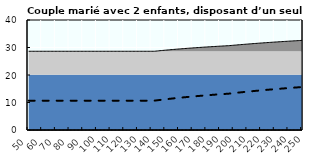
| Category | Coin fiscal moyen (somme des composantes) | Taux moyen d'imposition net en % du salaire brut |
|---|---|---|
| 50.0 | 28.633 | 10.67 |
| 51.0 | 28.633 | 10.67 |
| 52.0 | 28.633 | 10.67 |
| 53.0 | 28.633 | 10.67 |
| 54.0 | 28.633 | 10.67 |
| 55.0 | 28.633 | 10.67 |
| 56.0 | 28.633 | 10.67 |
| 57.0 | 28.633 | 10.67 |
| 58.0 | 28.633 | 10.67 |
| 59.0 | 28.633 | 10.67 |
| 60.0 | 28.633 | 10.67 |
| 61.0 | 28.633 | 10.67 |
| 62.0 | 28.633 | 10.67 |
| 63.0 | 28.633 | 10.67 |
| 64.0 | 28.633 | 10.67 |
| 65.0 | 28.633 | 10.67 |
| 66.0 | 28.633 | 10.67 |
| 67.0 | 28.633 | 10.67 |
| 68.0 | 28.633 | 10.67 |
| 69.0 | 28.633 | 10.67 |
| 70.0 | 28.633 | 10.67 |
| 71.0 | 28.633 | 10.67 |
| 72.0 | 28.633 | 10.67 |
| 73.0 | 28.633 | 10.67 |
| 74.0 | 28.633 | 10.67 |
| 75.0 | 28.633 | 10.67 |
| 76.0 | 28.633 | 10.67 |
| 77.0 | 28.633 | 10.67 |
| 78.0 | 28.633 | 10.67 |
| 79.0 | 28.633 | 10.67 |
| 80.0 | 28.633 | 10.67 |
| 81.0 | 28.633 | 10.67 |
| 82.0 | 28.633 | 10.67 |
| 83.0 | 28.633 | 10.67 |
| 84.0 | 28.633 | 10.67 |
| 85.0 | 28.633 | 10.67 |
| 86.0 | 28.633 | 10.67 |
| 87.0 | 28.633 | 10.67 |
| 88.0 | 28.633 | 10.67 |
| 89.0 | 28.633 | 10.67 |
| 90.0 | 28.633 | 10.67 |
| 91.0 | 28.633 | 10.67 |
| 92.0 | 28.633 | 10.67 |
| 93.0 | 28.633 | 10.67 |
| 94.0 | 28.633 | 10.67 |
| 95.0 | 28.633 | 10.67 |
| 96.0 | 28.633 | 10.67 |
| 97.0 | 28.633 | 10.67 |
| 98.0 | 28.633 | 10.67 |
| 99.0 | 28.633 | 10.67 |
| 100.0 | 28.633 | 10.67 |
| 101.0 | 28.633 | 10.67 |
| 102.0 | 28.633 | 10.67 |
| 103.0 | 28.633 | 10.67 |
| 104.0 | 28.633 | 10.67 |
| 105.0 | 28.633 | 10.67 |
| 106.0 | 28.633 | 10.67 |
| 107.0 | 28.633 | 10.67 |
| 108.0 | 28.633 | 10.67 |
| 109.0 | 28.633 | 10.67 |
| 110.0 | 28.633 | 10.67 |
| 111.0 | 28.633 | 10.67 |
| 112.0 | 28.633 | 10.67 |
| 113.0 | 28.633 | 10.67 |
| 114.0 | 28.633 | 10.67 |
| 115.0 | 28.633 | 10.67 |
| 116.0 | 28.633 | 10.67 |
| 117.0 | 28.633 | 10.67 |
| 118.0 | 28.633 | 10.67 |
| 119.0 | 28.633 | 10.67 |
| 120.0 | 28.633 | 10.67 |
| 121.0 | 28.633 | 10.67 |
| 122.0 | 28.633 | 10.67 |
| 123.0 | 28.633 | 10.67 |
| 124.0 | 28.633 | 10.67 |
| 125.0 | 28.633 | 10.67 |
| 126.0 | 28.633 | 10.67 |
| 127.0 | 28.633 | 10.67 |
| 128.0 | 28.633 | 10.67 |
| 129.0 | 28.633 | 10.67 |
| 130.0 | 28.633 | 10.67 |
| 131.0 | 28.633 | 10.67 |
| 132.0 | 28.633 | 10.67 |
| 133.0 | 28.633 | 10.67 |
| 134.0 | 28.633 | 10.67 |
| 135.0 | 28.633 | 10.67 |
| 136.0 | 28.633 | 10.67 |
| 137.0 | 28.633 | 10.67 |
| 138.0 | 28.633 | 10.67 |
| 139.0 | 28.633 | 10.67 |
| 140.0 | 28.633 | 10.67 |
| 141.0 | 28.633 | 10.67 |
| 142.0 | 28.64 | 10.679 |
| 143.0 | 28.692 | 10.743 |
| 144.0 | 28.742 | 10.806 |
| 145.0 | 28.792 | 10.869 |
| 146.0 | 28.841 | 10.93 |
| 147.0 | 28.889 | 10.991 |
| 148.0 | 28.937 | 11.051 |
| 149.0 | 28.984 | 11.11 |
| 150.0 | 29.031 | 11.168 |
| 151.0 | 29.077 | 11.226 |
| 152.0 | 29.122 | 11.282 |
| 153.0 | 29.167 | 11.338 |
| 154.0 | 29.211 | 11.394 |
| 155.0 | 29.255 | 11.448 |
| 156.0 | 29.298 | 11.502 |
| 157.0 | 29.34 | 11.555 |
| 158.0 | 29.382 | 11.608 |
| 159.0 | 29.424 | 11.659 |
| 160.0 | 29.464 | 11.711 |
| 161.0 | 29.505 | 11.761 |
| 162.0 | 29.545 | 11.811 |
| 163.0 | 29.584 | 11.86 |
| 164.0 | 29.623 | 11.909 |
| 165.0 | 29.661 | 11.957 |
| 166.0 | 29.699 | 12.005 |
| 167.0 | 29.737 | 12.052 |
| 168.0 | 29.774 | 12.098 |
| 169.0 | 29.811 | 12.144 |
| 170.0 | 29.847 | 12.189 |
| 171.0 | 29.883 | 12.234 |
| 172.0 | 29.918 | 12.278 |
| 173.0 | 29.953 | 12.322 |
| 174.0 | 29.987 | 12.365 |
| 175.0 | 30.022 | 12.408 |
| 176.0 | 30.055 | 12.45 |
| 177.0 | 30.089 | 12.492 |
| 178.0 | 30.122 | 12.533 |
| 179.0 | 30.154 | 12.574 |
| 180.0 | 30.187 | 12.615 |
| 181.0 | 30.219 | 12.655 |
| 182.0 | 30.25 | 12.694 |
| 183.0 | 30.281 | 12.733 |
| 184.0 | 30.312 | 12.772 |
| 185.0 | 30.343 | 12.81 |
| 186.0 | 30.373 | 12.848 |
| 187.0 | 30.403 | 12.886 |
| 188.0 | 30.433 | 12.923 |
| 189.0 | 30.462 | 12.959 |
| 190.0 | 30.491 | 12.995 |
| 191.0 | 30.52 | 13.031 |
| 192.0 | 30.548 | 13.067 |
| 193.0 | 30.576 | 13.102 |
| 194.0 | 30.604 | 13.137 |
| 195.0 | 30.631 | 13.171 |
| 196.0 | 30.659 | 13.205 |
| 197.0 | 30.697 | 13.253 |
| 198.0 | 30.742 | 13.309 |
| 199.0 | 30.786 | 13.365 |
| 200.0 | 30.831 | 13.421 |
| 201.0 | 30.874 | 13.476 |
| 202.0 | 30.918 | 13.53 |
| 203.0 | 30.961 | 13.584 |
| 204.0 | 31.003 | 13.637 |
| 205.0 | 31.045 | 13.689 |
| 206.0 | 31.087 | 13.742 |
| 207.0 | 31.128 | 13.793 |
| 208.0 | 31.169 | 13.844 |
| 209.0 | 31.21 | 13.895 |
| 210.0 | 31.25 | 13.945 |
| 211.0 | 31.289 | 13.995 |
| 212.0 | 31.329 | 14.044 |
| 213.0 | 31.368 | 14.093 |
| 214.0 | 31.406 | 14.141 |
| 215.0 | 31.445 | 14.189 |
| 216.0 | 31.483 | 14.237 |
| 217.0 | 31.52 | 14.284 |
| 218.0 | 31.557 | 14.33 |
| 219.0 | 31.594 | 14.376 |
| 220.0 | 31.631 | 14.422 |
| 221.0 | 31.667 | 14.468 |
| 222.0 | 31.703 | 14.512 |
| 223.0 | 31.738 | 14.557 |
| 224.0 | 31.774 | 14.601 |
| 225.0 | 31.809 | 14.645 |
| 226.0 | 31.843 | 14.688 |
| 227.0 | 31.877 | 14.731 |
| 228.0 | 31.912 | 14.774 |
| 229.0 | 31.945 | 14.816 |
| 230.0 | 31.979 | 14.858 |
| 231.0 | 32.012 | 14.899 |
| 232.0 | 32.045 | 14.94 |
| 233.0 | 32.077 | 14.981 |
| 234.0 | 32.109 | 15.021 |
| 235.0 | 32.141 | 15.061 |
| 236.0 | 32.173 | 15.101 |
| 237.0 | 32.205 | 15.141 |
| 238.0 | 32.236 | 15.18 |
| 239.0 | 32.267 | 15.218 |
| 240.0 | 32.298 | 15.257 |
| 241.0 | 32.328 | 15.295 |
| 242.0 | 32.358 | 15.333 |
| 243.0 | 32.388 | 15.37 |
| 244.0 | 32.418 | 15.407 |
| 245.0 | 32.447 | 15.444 |
| 246.0 | 32.476 | 15.481 |
| 247.0 | 32.505 | 15.517 |
| 248.0 | 32.534 | 15.553 |
| 249.0 | 32.563 | 15.589 |
| 250.0 | 32.591 | 15.624 |